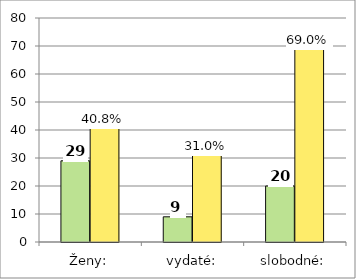
| Category | Series 0 | Series 1 |
|---|---|---|
| Ženy: | 29 | 40.845 |
| vydaté: | 9 | 31.034 |
| slobodné: | 20 | 68.966 |